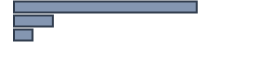
| Category | Percentatge |
|---|---|
| 0 | 76.14 |
| 1 | 16.195 |
| 2 | 7.665 |